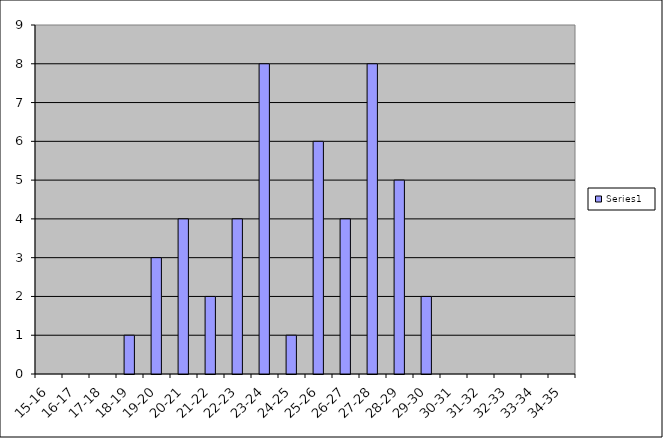
| Category | Series 0 |
|---|---|
| 15-16 | 0 |
| 16-17 | 0 |
| 17-18 | 0 |
| 18-19 | 1 |
| 19-20 | 3 |
| 20-21 | 4 |
| 21-22 | 2 |
| 22-23 | 4 |
| 23-24 | 8 |
| 24-25 | 1 |
| 25-26 | 6 |
| 26-27 | 4 |
| 27-28 | 8 |
| 28-29 | 5 |
| 29-30 | 2 |
| 30-31 | 0 |
| 31-32 | 0 |
| 32-33 | 0 |
| 33-34 | 0 |
| 34-35 | 0 |